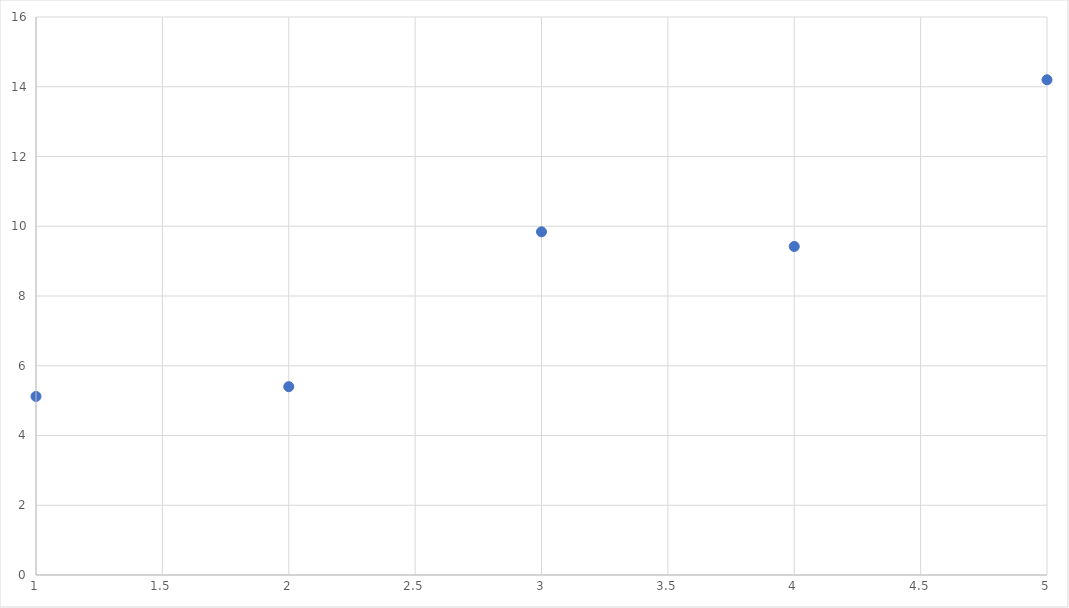
| Category | y |
|---|---|
| 1.0 | 5.12 |
| 2.0 | 5.4 |
| 3.0 | 9.84 |
| 4.0 | 9.42 |
| 5.0 | 14.2 |